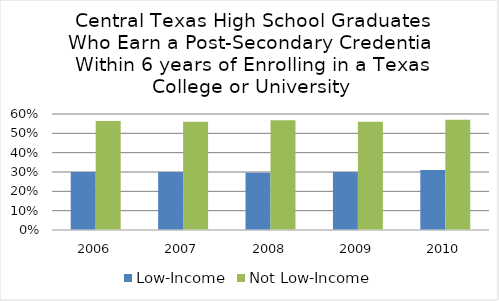
| Category | Low-Income | Not Low-Income |
|---|---|---|
| 2006.0 | 0.3 | 0.563 |
| 2007.0 | 0.3 | 0.56 |
| 2008.0 | 0.296 | 0.568 |
| 2009.0 | 0.3 | 0.56 |
| 2010.0 | 0.31 | 0.57 |